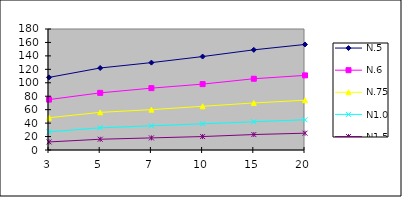
| Category | N.5 | N.6 | N.75 | N1.0 | N1.5 |
|---|---|---|---|---|---|
| 3.0 | 108 | 75 | 48 | 27 | 12 |
| 5.0 | 122 | 85 | 56 | 33 | 16 |
| 7.0 | 130 | 92 | 60 | 36 | 18 |
| 10.0 | 139 | 98 | 65 | 39 | 20 |
| 15.0 | 149 | 106 | 70 | 42 | 23 |
| 20.0 | 157 | 111 | 74 | 45 | 25 |